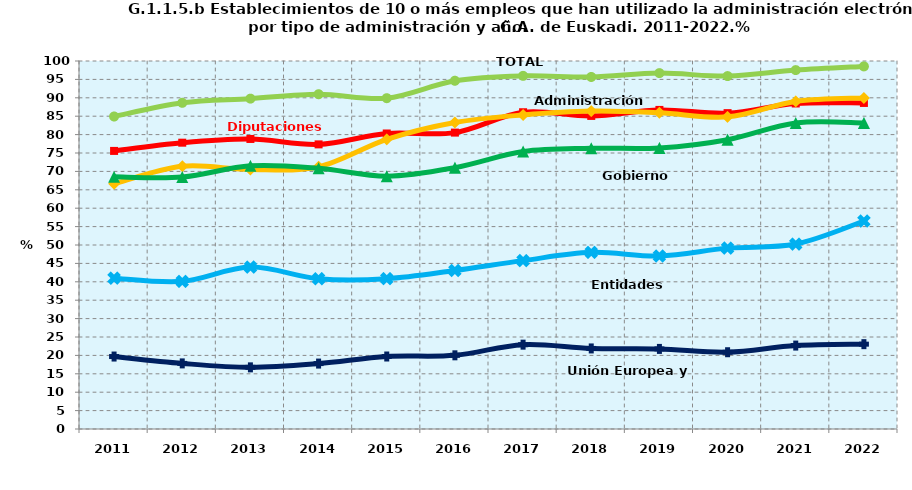
| Category | TOTAL | Diputaciones Forales | Administración Central | Gobierno Vasco | Entidades Locales | Unión Europea y Otros |
|---|---|---|---|---|---|---|
| 2011.0 | 84.919 | 75.566 | 66.635 | 68.518 | 40.99 | 19.69 |
| 2012.0 | 88.639 | 77.803 | 71.399 | 68.457 | 40.12 | 17.825 |
| 2013.0 | 89.774 | 78.814 | 70.5 | 71.513 | 43.99 | 16.752 |
| 2014.0 | 90.972 | 77.343 | 71.245 | 70.852 | 40.845 | 17.779 |
| 2015.0 | 89.9 | 80.3 | 78.7 | 68.7 | 40.845 | 19.7 |
| 2016.0 | 94.63 | 80.543 | 83.285 | 71.025 | 43.062 | 20.023 |
| 2017.0 | 95.964 | 86.074 | 85.341 | 75.396 | 45.758 | 22.918 |
| 2018.0 | 95.655 | 85.076 | 86.41 | 76.28 | 48.003 | 21.89 |
| 2019.0 | 96.71 | 86.706 | 85.942 | 76.372 | 47.022 | 21.763 |
| 2020.0 | 95.9 | 85.833 | 84.824 | 78.619 | 49.153 | 20.862 |
| 2021.0 | 97.529 | 88.456 | 89.021 | 83.165 | 50.257 | 22.668 |
| 2022.0 | 98.531 | 88.602 | 89.957 | 83.165 | 56.505 | 23.053 |